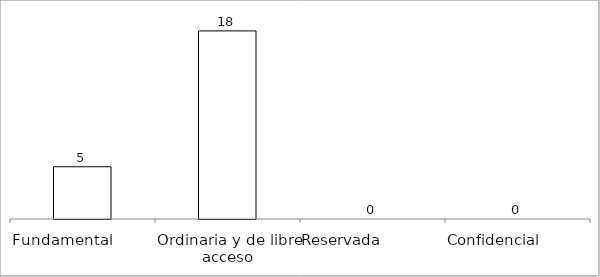
| Category | Series 0 |
|---|---|
| Fundamental         | 5 |
| Ordinaria y de libre acceso | 18 |
| Reservada               | 0 |
| Confidencial             | 0 |